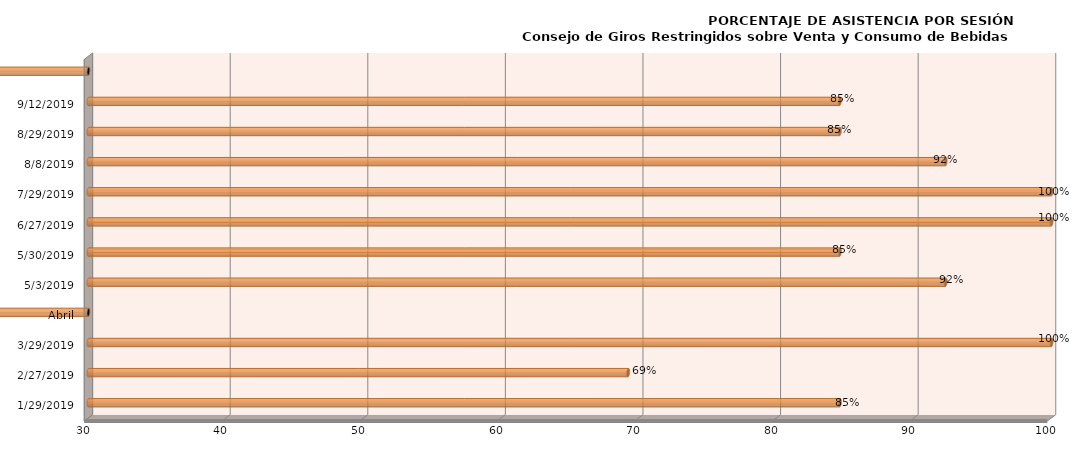
| Category | Series 0 |
|---|---|
| 29/01/2019 | 84.615 |
| 27/02/2019 | 69.231 |
| 29/03/2019 | 100 |
| Abril | 0 |
| 03/05/2019 | 92.308 |
| 30/05/2019 | 84.615 |
| 27/06/2019 | 100 |
| 29/07/2019 | 100 |
| 08/08/2019 | 92.308 |
| 29/08/2019 | 84.615 |
| 12/09/2019 | 84.615 |